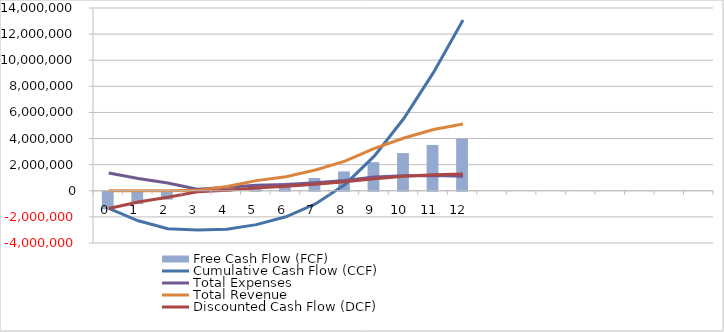
| Category | Free Cash Flow (FCF) |
|---|---|
| 0  | -1355813.953 |
| 1  | -944186.047 |
| 2  | -600000 |
| 3  | -98500 |
| 4  | 49316 |
| 5  | 355807.888 |
| 6  | 601872.297 |
| 7  | 981627.983 |
| 8  | 1485432.001 |
| 9  | 2192930.66 |
| 10  | 2884189.424 |
| 11  | 3512665.449 |
| 12  | 4008515.894 |
|   | 0 |
|   | 0 |
|   | 0 |
|   | 0 |
|   | 0 |
|   | 0 |
|   | 0 |
|   | 0 |